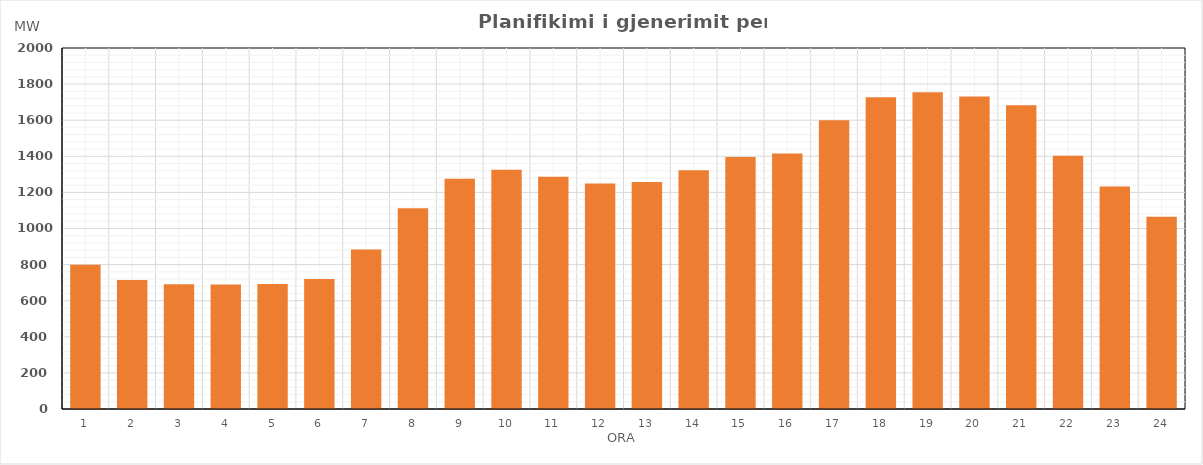
| Category | Max (MW) |
|---|---|
| 0 | 798.94 |
| 1 | 714.54 |
| 2 | 691.73 |
| 3 | 690.25 |
| 4 | 692.93 |
| 5 | 720.55 |
| 6 | 884.08 |
| 7 | 1111.97 |
| 8 | 1275.52 |
| 9 | 1326.14 |
| 10 | 1287.04 |
| 11 | 1249.01 |
| 12 | 1257.81 |
| 13 | 1322.81 |
| 14 | 1396.39 |
| 15 | 1415.8 |
| 16 | 1600.06 |
| 17 | 1727.21 |
| 18 | 1755.13 |
| 19 | 1731.65 |
| 20 | 1682.14 |
| 21 | 1402.36 |
| 22 | 1232.76 |
| 23 | 1065.76 |